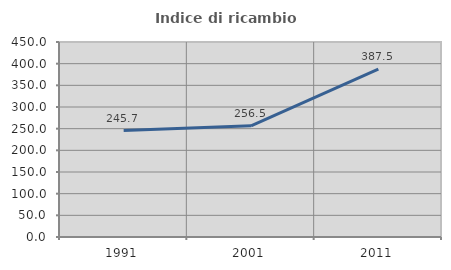
| Category | Indice di ricambio occupazionale  |
|---|---|
| 1991.0 | 245.714 |
| 2001.0 | 256.522 |
| 2011.0 | 387.5 |